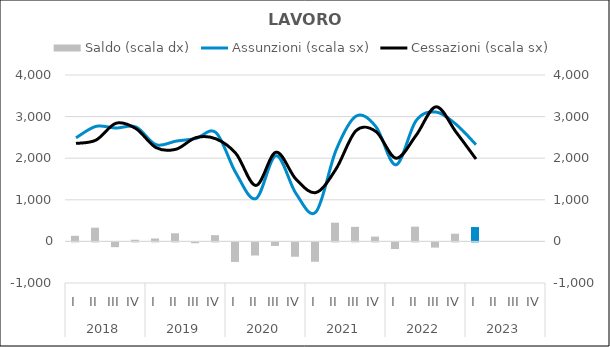
| Category | Saldo (scala dx) |
|---|---|
| 0 | 135 |
| 1 | 330 |
| 2 | -115 |
| 3 | 40 |
| 4 | 70 |
| 5 | 195 |
| 6 | -20 |
| 7 | 150 |
| 8 | -470 |
| 9 | -315 |
| 10 | -85 |
| 11 | -345 |
| 12 | -465 |
| 13 | 450 |
| 14 | 350 |
| 15 | 115 |
| 16 | -160 |
| 17 | 355 |
| 18 | -125 |
| 19 | 185 |
| 20 | 345 |
| 21 | 0 |
| 22 | 0 |
| 23 | 0 |